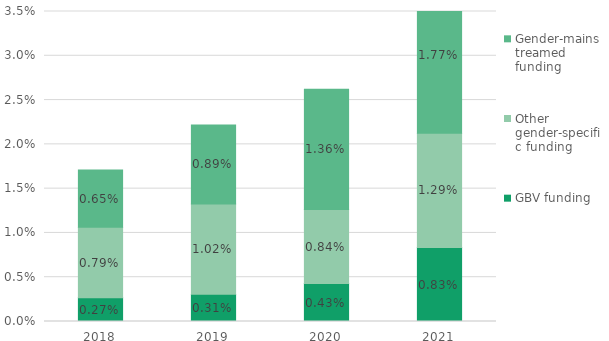
| Category | GBV funding | Other gender-specific funding  | Gender-mainstreamed funding  |
|---|---|---|---|
| 2018.0 | 0.003 | 0.008 | 0.006 |
| 2019.0 | 0.003 | 0.01 | 0.009 |
| 2020.0 | 0.004 | 0.008 | 0.014 |
| 2021.0 | 0.008 | 0.013 | 0.018 |